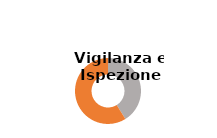
| Category | Series 0 |
|---|---|
| 0 | 0.412 |
| 1 | 0.588 |